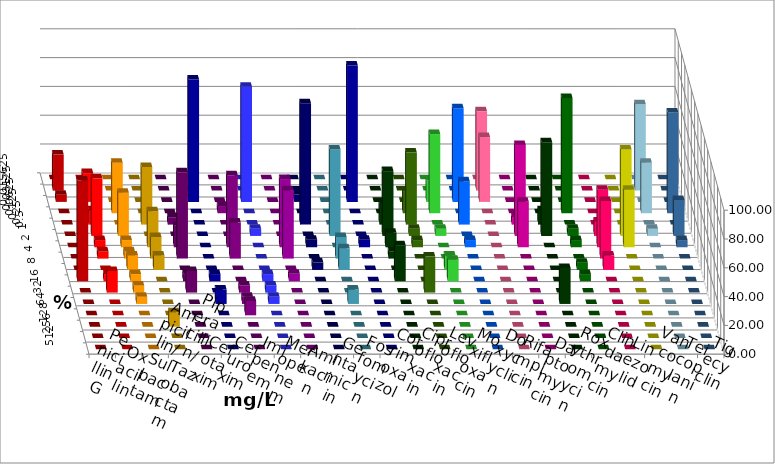
| Category | Penicillin G | Oxacillin | Ampicillin/ Sulbactam | Piperacillin/ Tazobactam | Cefotaxim | Cefuroxim | Imipenem | Meropenem | Amikacin | Gentamicin | Fosfomycin | Cotrimoxazol | Ciprofloxacin | Levofloxacin | Moxifloxacin | Doxycyclin | Rifampicin | Daptomycin | Roxythromycin | Clindamycin | Linezolid | Vancomycin | Teicoplanin | Tigecyclin |
|---|---|---|---|---|---|---|---|---|---|---|---|---|---|---|---|---|---|---|---|---|---|---|---|---|
| 0.015625 | 0 | 0 | 0 | 0 | 0 | 0 | 0 | 0 | 0 | 0 | 0 | 0 | 0 | 0 | 0 | 0 | 0 | 0 | 0 | 0 | 0 | 0 | 0 | 0 |
| 0.03125 | 25 | 0 | 0 | 0 | 0 | 0 | 0 | 0 | 0 | 0 | 0 | 0 | 0 | 0 | 0 | 0 | 55 | 0 | 0 | 0 | 0 | 0 | 0 | 60 |
| 0.0625 | 5 | 20 | 0 | 0 | 0 | 0 | 85 | 80 | 0 | 5.263 | 0 | 94.737 | 0 | 0 | 15 | 65 | 45 | 0 | 0 | 0 | 0 | 0 | 0 | 0 |
| 0.125 | 0 | 0 | 35 | 0 | 0 | 5 | 0 | 0 | 0 | 0 | 0 | 0 | 0 | 15 | 55 | 0 | 0 | 0 | 0 | 80 | 0 | 0 | 70 | 35 |
| 0.25 | 0 | 10 | 0 | 40 | 5 | 0 | 0 | 0 | 0 | 84.211 | 0 | 0 | 15 | 50 | 0 | 30 | 0 | 5.263 | 10 | 0 | 0 | 0 | 0 | 0 |
| 0.5 | 0 | 40 | 30 | 0 | 0 | 0 | 0 | 5 | 0 | 0 | 60 | 0 | 45 | 5 | 5 | 0 | 0 | 63.158 | 65 | 5 | 10 | 60 | 25 | 5 |
| 1.0 | 0 | 5 | 5 | 25 | 15 | 50 | 0 | 0 | 47.368 | 5.263 | 0 | 5.263 | 10 | 5 | 0 | 5 | 0 | 31.579 | 0 | 5 | 40 | 40 | 5 | 0 |
| 2.0 | 0 | 5 | 5 | 15 | 60 | 25 | 0 | 0 | 47.368 | 0 | 15 | 0 | 5 | 0 | 0 | 0 | 0 | 0 | 0 | 0 | 40 | 0 | 0 | 0 |
| 4.0 | 0 | 0 | 10 | 10 | 0 | 0 | 0 | 0 | 0 | 5.263 | 15 | 0 | 0 | 0 | 10 | 0 | 0 | 0 | 0 | 5 | 10 | 0 | 0 | 0 |
| 8.0 | 70 | 5 | 5 | 0 | 5 | 0 | 5 | 5 | 5.263 | 0 | 0 | 0 | 25 | 0 | 15 | 0 | 0 | 0 | 0 | 5 | 0 | 0 | 0 | 0 |
| 16.0 | 0 | 15 | 5 | 0 | 15 | 5 | 0 | 5 | 0 | 0 | 0 | 0 | 0 | 25 | 0 | 0 | 0 | 0 | 0 | 0 | 0 | 0 | 0 | 0 |
| 32.0 | 0 | 0 | 5 | 0 | 0 | 5 | 10 | 5 | 0 | 0 | 10 | 0 | 0 | 0 | 0 | 0 | 0 | 0 | 25 | 0 | 0 | 0 | 0 | 0 |
| 64.0 | 0 | 0 | 0 | 0 | 0 | 10 | 0 | 0 | 0 | 0 | 0 | 0 | 0 | 0 | 0 | 0 | 0 | 0 | 0 | 0 | 0 | 0 | 0 | 0 |
| 128.0 | 0 | 0 | 0 | 10 | 0 | 0 | 0 | 0 | 0 | 0 | 0 | 0 | 0 | 0 | 0 | 0 | 0 | 0 | 0 | 0 | 0 | 0 | 0 | 0 |
| 256.0 | 0 | 0 | 0 | 0 | 0 | 0 | 0 | 0 | 0 | 0 | 0 | 0 | 0 | 0 | 0 | 0 | 0 | 0 | 0 | 0 | 0 | 0 | 0 | 0 |
| 512.0 | 0 | 0 | 0 | 0 | 0 | 0 | 0 | 0 | 0 | 0 | 0 | 0 | 0 | 0 | 0 | 0 | 0 | 0 | 0 | 0 | 0 | 0 | 0 | 0 |